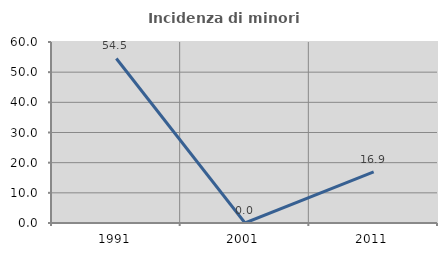
| Category | Incidenza di minori stranieri |
|---|---|
| 1991.0 | 54.545 |
| 2001.0 | 0 |
| 2011.0 | 16.949 |